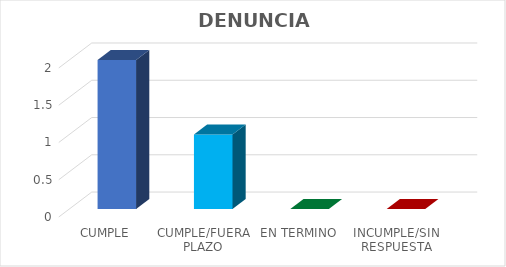
| Category | Series 0 |
|---|---|
| CUMPLE | 2 |
| CUMPLE/FUERA PLAZO | 1 |
| EN TERMINO | 0 |
| INCUMPLE/SIN RESPUESTA | 0 |